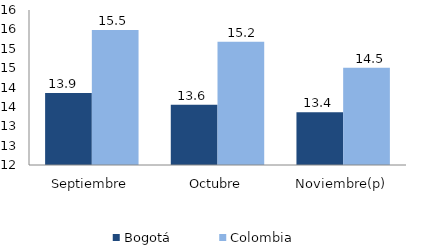
| Category | Bogotá | Colombia |
|---|---|---|
| Septiembre | 13.861 | 15.485 |
| Octubre | 13.555 | 15.178 |
| Noviembre(p) | 13.359 | 14.511 |